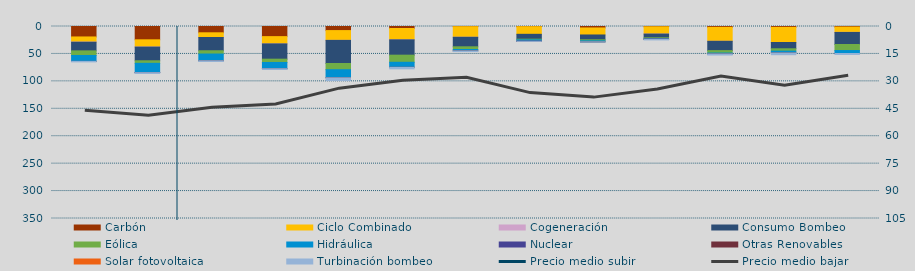
| Category | Carbón | Ciclo Combinado | Cogeneración | Consumo Bombeo | Eólica | Hidráulica | Nuclear | Otras Renovables | Solar fotovoltaica | Turbinación bombeo |
|---|---|---|---|---|---|---|---|---|---|---|
| N | 19052.6 | 9321.8 | 284.1 | 15774.3 | 8408.4 | 10736.9 | 0 | 4.4 | 0 | 901.6 |
| D | 24263.8 | 13149.5 | 124.5 | 24953.2 | 4628 | 16969.4 | 18 | 13.3 | 0 | 1598.3 |
| E | 11468 | 8546.1 | 24.8 | 24157.8 | 5990.6 | 12234.2 | 0 | 55 | 0 | 1264.7 |
| F | 18455.5 | 13295.6 | 2.4 | 27803.3 | 6004.9 | 11413.9 | 0 | 5.4 | 0 | 1349.1 |
| M | 7438 | 17871.7 | 7 | 42074.9 | 11356 | 14642.1 | 0 | 139.1 | 0 | 4992 |
| A | 3690.3 | 20633.5 | 19.2 | 27916.2 | 12958.7 | 9108.9 | 0 | 103.2 | 0 | 2727.4 |
| M | 361.5 | 19230.2 | 80.6 | 17332.6 | 4925.2 | 2441.8 | 0 | 127.2 | 0 | 1259.2 |
| J | 346.1 | 13888.5 | 0 | 8869 | 1186.7 | 2488.5 | 187.1 | 15.9 | 0 | 184.3 |
| J | 2658.9 | 12785.9 | 0 | 8749.3 | 1887.5 | 1893.1 | 0 | 9.8 | 0 | 57.5 |
| A | 567.2 | 13236.4 | 10 | 6766.4 | 1241.9 | 1156.9 | 173 | 38 | 0 | 1232.6 |
| S | 1539.8 | 25452.8 | 8.7 | 16928.4 | 4457.4 | 1540.4 | 0 | 149.5 | 0 | 1916.2 |
| O | 1567.5 | 27564.7 | 0 | 11468.6 | 4269.6 | 3292.2 | 0 | 125.3 | 0 | 3130.6 |
| N | 1032.3 | 9659.8 | 141 | 22022.6 | 10965.1 | 5345.6 | 22.6 | 8.3 | 0 | 1780.7 |